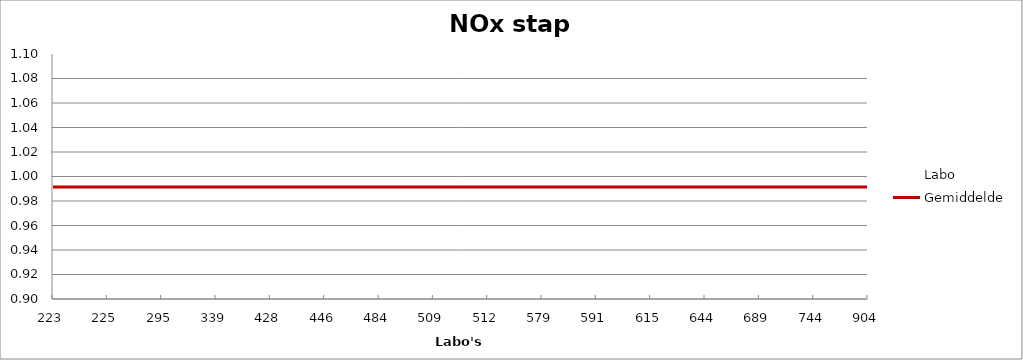
| Category | Labo | Gemiddelde |
|---|---|---|
| 223.0 | 1.074 | 0.991 |
| 225.0 | 0.956 | 0.991 |
| 295.0 | 1.026 | 0.991 |
| 339.0 | 0.928 | 0.991 |
| 428.0 | 1.017 | 0.991 |
| 446.0 | 1 | 0.991 |
| 484.0 | 0.987 | 0.991 |
| 509.0 | 0.985 | 0.991 |
| 512.0 | 1.018 | 0.991 |
| 579.0 | 0.997 | 0.991 |
| 591.0 | 0.974 | 0.991 |
| 615.0 | 0.979 | 0.991 |
| 644.0 | 1.067 | 0.991 |
| 689.0 | 0.934 | 0.991 |
| 744.0 | 0.995 | 0.991 |
| 904.0 | 0.956 | 0.991 |